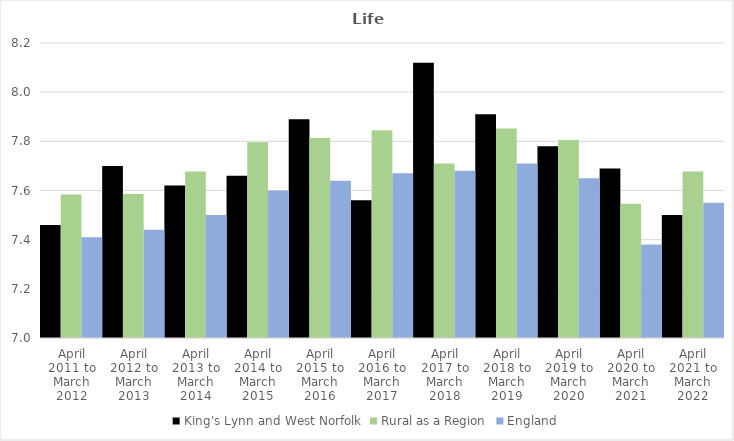
| Category | King's Lynn and West Norfolk | Rural as a Region | England |
|---|---|---|---|
| April 2011 to March 2012 | 7.46 | 7.584 | 7.41 |
| April 2012 to March 2013 | 7.7 | 7.586 | 7.44 |
| April 2013 to March 2014 | 7.62 | 7.677 | 7.5 |
| April 2014 to March 2015 | 7.66 | 7.797 | 7.6 |
| April 2015 to March 2016 | 7.89 | 7.813 | 7.64 |
| April 2016 to March 2017 | 7.56 | 7.845 | 7.67 |
| April 2017 to March 2018 | 8.12 | 7.71 | 7.68 |
| April 2018 to March 2019 | 7.91 | 7.852 | 7.71 |
| April 2019 to March 2020 | 7.78 | 7.806 | 7.65 |
| April 2020 to March 2021 | 7.69 | 7.546 | 7.38 |
| April 2021 to March 2022 | 7.5 | 7.677 | 7.55 |